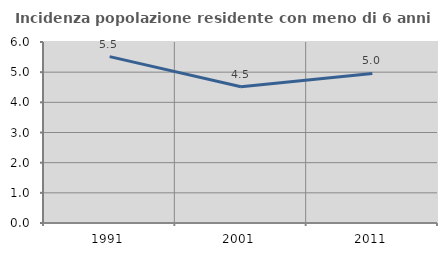
| Category | Incidenza popolazione residente con meno di 6 anni |
|---|---|
| 1991.0 | 5.514 |
| 2001.0 | 4.518 |
| 2011.0 | 4.959 |